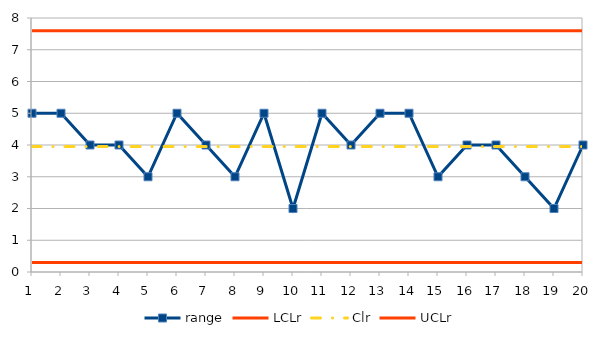
| Category | range | LCLr | Clr | UCLr |
|---|---|---|---|---|
| 0 | 5 | 0.299 | 3.95 | 7.601 |
| 1 | 5 | 0.299 | 3.95 | 7.601 |
| 2 | 4 | 0.299 | 3.95 | 7.601 |
| 3 | 4 | 0.299 | 3.95 | 7.601 |
| 4 | 3 | 0.299 | 3.95 | 7.601 |
| 5 | 5 | 0.299 | 3.95 | 7.601 |
| 6 | 4 | 0.299 | 3.95 | 7.601 |
| 7 | 3 | 0.299 | 3.95 | 7.601 |
| 8 | 5 | 0.299 | 3.95 | 7.601 |
| 9 | 2 | 0.299 | 3.95 | 7.601 |
| 10 | 5 | 0.299 | 3.95 | 7.601 |
| 11 | 4 | 0.299 | 3.95 | 7.601 |
| 12 | 5 | 0.299 | 3.95 | 7.601 |
| 13 | 5 | 0.299 | 3.95 | 7.601 |
| 14 | 3 | 0.299 | 3.95 | 7.601 |
| 15 | 4 | 0.299 | 3.95 | 7.601 |
| 16 | 4 | 0.299 | 3.95 | 7.601 |
| 17 | 3 | 0.299 | 3.95 | 7.601 |
| 18 | 2 | 0.299 | 3.95 | 7.601 |
| 19 | 4 | 0.299 | 3.95 | 7.601 |